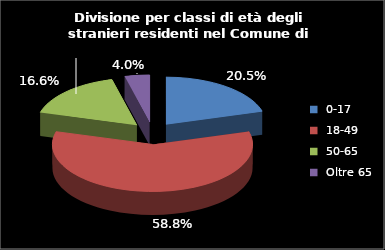
| Category | Series 0 |
|---|---|
| 0-17 | 396 |
| 18-49 | 1135 |
| 50-65 | 321 |
| Oltre 65 | 77 |